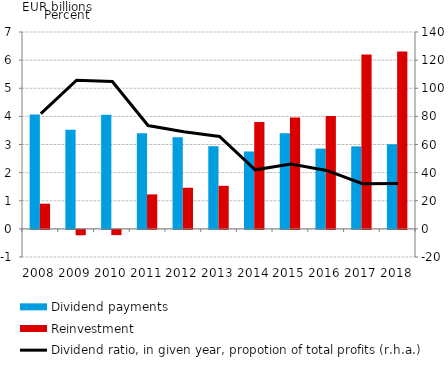
| Category | Dividend payments | Reinvestment |
|---|---|---|
| 2008.0 | 4.064 | 0.895 |
| 2009.0 | 3.522 | -0.192 |
| 2010.0 | 4.061 | -0.186 |
| 2011.0 | 3.399 | 1.226 |
| 2012.0 | 3.253 | 1.462 |
| 2013.0 | 2.938 | 1.531 |
| 2014.0 | 2.751 | 3.802 |
| 2015.0 | 3.396 | 3.962 |
| 2016.0 | 2.853 | 4.01 |
| 2017.0 | 2.933 | 6.204 |
| 2018.0 | 3.011 | 6.303 |